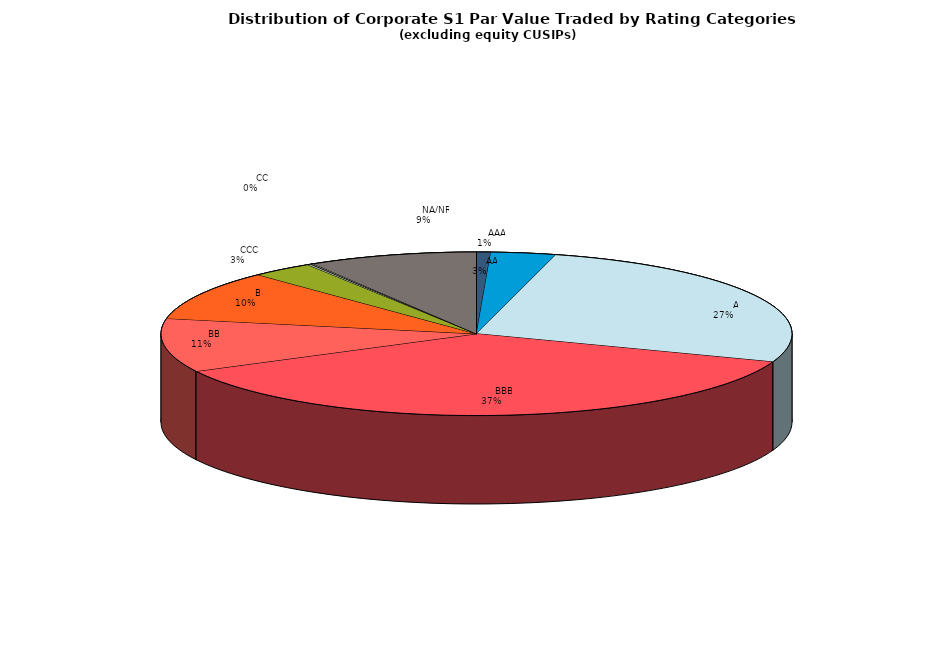
| Category | Series 0 |
|---|---|
|         AAA | 311579578.977 |
|         AA | 1423600620.846 |
|         A | 11374094085.125 |
|         BBB | 15780285327.183 |
|         BB | 4538321030.117 |
|         B | 4205728829.361 |
|         CCC | 1365523069.907 |
|         CC | 78683240.534 |
|         C | 18061984 |
|         D | 43457131.672 |
|         NA/NR | 3709993700.22 |